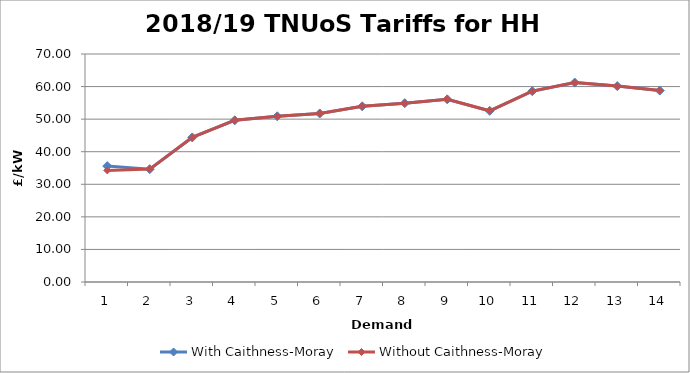
| Category | With Caithness-Moray | Without Caithness-Moray |
|---|---|---|
| 1.0 | 35.59 | 34.265 |
| 2.0 | 34.644 | 34.656 |
| 3.0 | 44.384 | 44.397 |
| 4.0 | 49.657 | 49.674 |
| 5.0 | 50.879 | 50.894 |
| 6.0 | 51.733 | 51.749 |
| 7.0 | 53.941 | 53.956 |
| 8.0 | 54.897 | 54.913 |
| 9.0 | 56.091 | 56.106 |
| 10.0 | 52.548 | 52.563 |
| 11.0 | 58.58 | 58.595 |
| 12.0 | 61.229 | 61.244 |
| 13.0 | 60.145 | 60.16 |
| 14.0 | 58.774 | 58.789 |